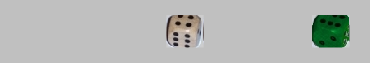
| Category | 1 | 2 | 3 | 4 | 5 | 6 |
|---|---|---|---|---|---|---|
|  | 0 | 0 | 0 | 0 | 0 | 0 |
|  | 0 | 0 | 0 | 0 | 0 | 0 |
|  | 0 | 0 | 0 | 0 | 0 | 0 |
| 4 | 0 | 0 | 0 | 1 | 0 | 0 |
|  | 0 | 0 | 0 | 0 | 0 | 0 |
|  | 0 | 0 | 0 | 0 | 0 | 0 |
| 6 | 0 | 0 | 0 | 0 | 0 | 1 |